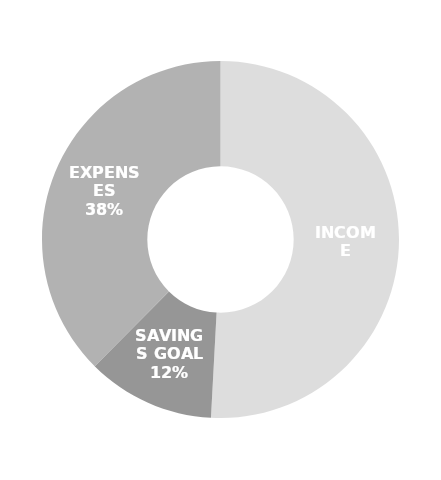
| Category | Series 0 |
|---|---|
| INCOME | 7257 |
| SAVINGS GOAL | 1655 |
| EXPENSES | 5359 |